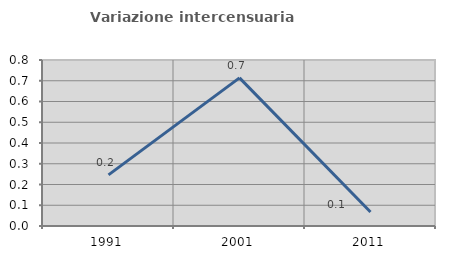
| Category | Variazione intercensuaria annua |
|---|---|
| 1991.0 | 0.246 |
| 2001.0 | 0.714 |
| 2011.0 | 0.068 |